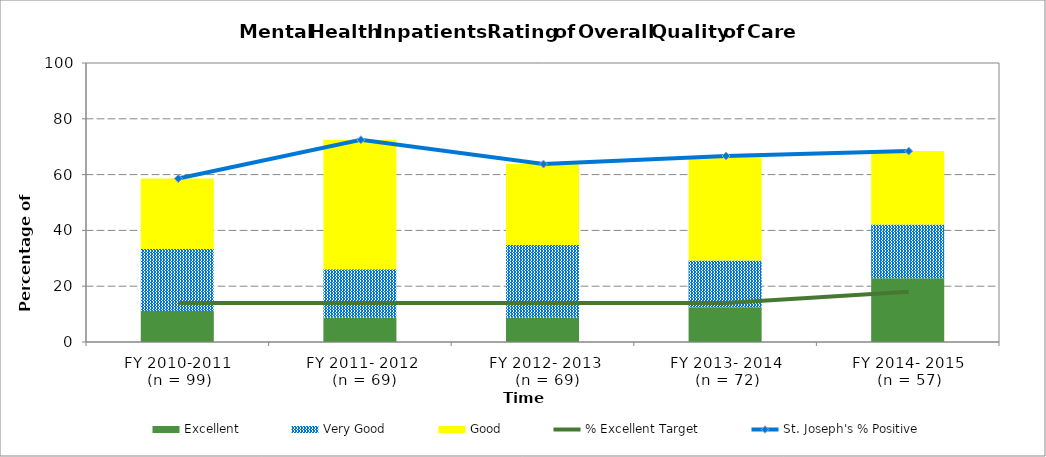
| Category | Excellent | Very Good | Good |
|---|---|---|---|
| FY 2010-2011 
(n = 99) | 11.11 | 22.22 | 25.25 |
| FY 2011- 2012
 (n = 69) | 8.7 | 17.39 | 46.38 |
| FY 2012- 2013
 (n = 69) | 8.7 | 26.09 | 28.99 |
| FY 2013- 2014 
(n = 72) | 12.5 | 16.67 | 37.5 |
| FY 2014- 2015 
(n = 57) | 22.81 | 19.3 | 26.32 |